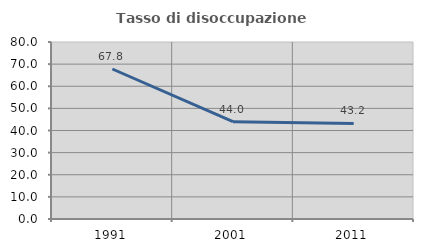
| Category | Tasso di disoccupazione giovanile  |
|---|---|
| 1991.0 | 67.797 |
| 2001.0 | 43.956 |
| 2011.0 | 43.182 |